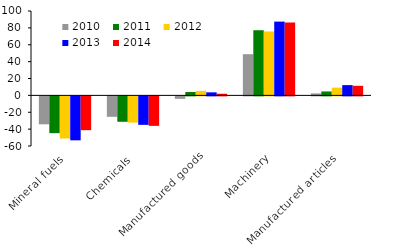
| Category | 2010 | 2011 | 2012 | 2013 | 2014 |
|---|---|---|---|---|---|
| Mineral fuels | -33.122 | -43.599 | -49.965 | -52.094 | -40.065 |
| Chemicals | -24.225 | -30.127 | -31.066 | -33.75 | -34.959 |
| Manufactured goods | -2.907 | 3.994 | 5.295 | 3.578 | 1.932 |
| Machinery | 48.798 | 77.214 | 75.75 | 87.433 | 86.359 |
| Manufactured articles | 2.326 | 4.657 | 9.183 | 12.146 | 11.357 |